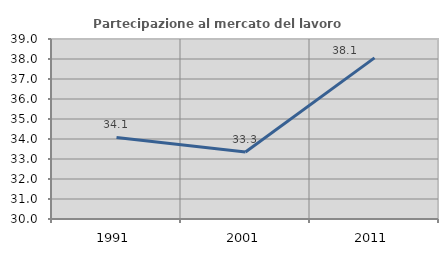
| Category | Partecipazione al mercato del lavoro  femminile |
|---|---|
| 1991.0 | 34.08 |
| 2001.0 | 33.346 |
| 2011.0 | 38.058 |